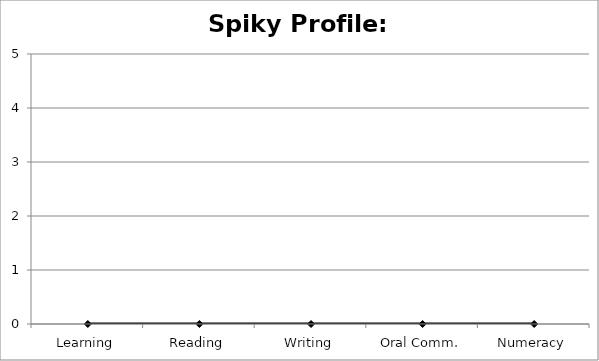
| Category | Training Specification: |
|---|---|
| Learning | 0 |
| Reading | 0 |
| Writing | 0 |
| Oral Comm. | 0 |
| Numeracy | 0 |